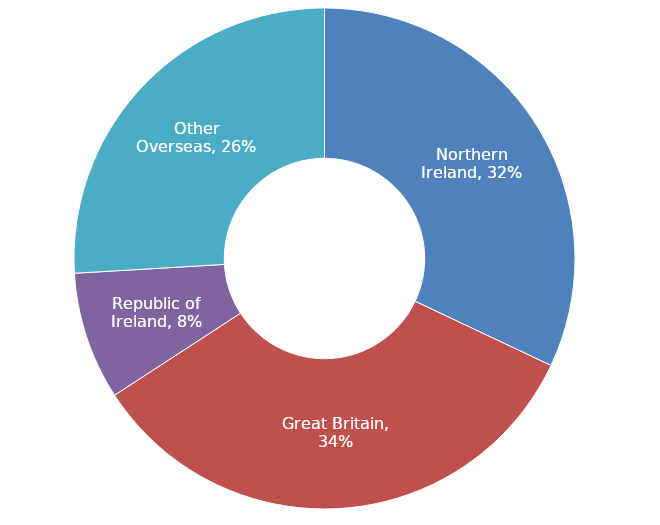
| Category | Series 0 |
|---|---|
| Northern Ireland | 0.32 |
| Great Britain | 0.338 |
| Republic of Ireland | 0.082 |
| Other Overseas | 0.259 |